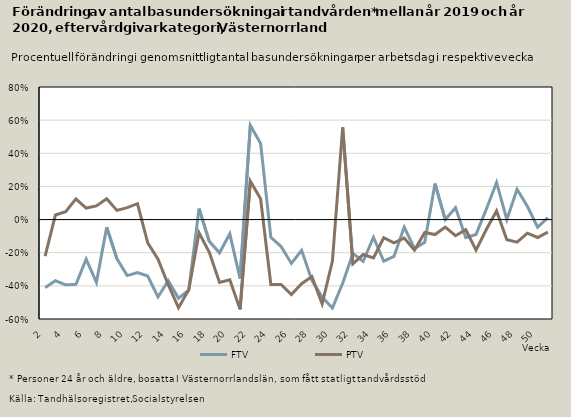
| Category | FTV | PTV |
|---|---|---|
| 2.0 | -0.411 | -0.221 |
| 3.0 | -0.369 | 0.027 |
| 4.0 | -0.394 | 0.048 |
| 5.0 | -0.391 | 0.125 |
| 6.0 | -0.239 | 0.07 |
| 7.0 | -0.379 | 0.082 |
| 8.0 | -0.046 | 0.126 |
| 9.0 | -0.237 | 0.055 |
| 10.0 | -0.338 | 0.072 |
| 11.0 | -0.319 | 0.096 |
| 12.0 | -0.34 | -0.14 |
| 13.0 | -0.467 | -0.239 |
| 14.0 | -0.369 | -0.393 |
| 15.0 | -0.475 | -0.532 |
| 16.0 | -0.426 | -0.423 |
| 17.0 | 0.066 | -0.08 |
| 18.0 | -0.132 | -0.197 |
| 19.0 | -0.2 | -0.379 |
| 20.0 | -0.086 | -0.364 |
| 21.0 | -0.357 | -0.542 |
| 22.0 | 0.568 | 0.232 |
| 23.0 | 0.46 | 0.126 |
| 24.0 | -0.107 | -0.392 |
| 25.0 | -0.163 | -0.392 |
| 26.0 | -0.265 | -0.452 |
| 27.0 | -0.186 | -0.387 |
| 28.0 | -0.367 | -0.344 |
| 29.0 | -0.467 | -0.509 |
| 30.0 | -0.534 | -0.25 |
| 31.0 | -0.385 | 0.557 |
| 32.0 | -0.205 | -0.267 |
| 33.0 | -0.253 | -0.211 |
| 34.0 | -0.107 | -0.231 |
| 35.0 | -0.251 | -0.11 |
| 36.0 | -0.222 | -0.14 |
| 37.0 | -0.045 | -0.112 |
| 38.0 | -0.175 | -0.185 |
| 39.0 | -0.137 | -0.078 |
| 40.0 | 0.217 | -0.09 |
| 41.0 | 0 | -0.045 |
| 42.0 | 0.072 | -0.098 |
| 43.0 | -0.109 | -0.061 |
| 44.0 | -0.09 | -0.184 |
| 45.0 | 0.062 | -0.06 |
| 46.0 | 0.224 | 0.052 |
| 47.0 | 0 | -0.122 |
| 48.0 | 0.183 | -0.137 |
| 49.0 | 0.08 | -0.082 |
| 50.0 | -0.046 | -0.108 |
| 51.0 | 0.012 | -0.076 |